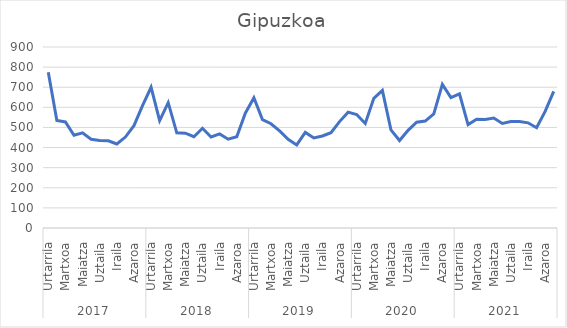
| Category | Gipuzkoa |
|---|---|
| 0 | 774.143 |
| 1 | 535 |
| 2 | 527.429 |
| 3 | 461.429 |
| 4 | 472.857 |
| 5 | 441.571 |
| 6 | 435.571 |
| 7 | 433.714 |
| 8 | 417.857 |
| 9 | 452.143 |
| 10 | 508.714 |
| 11 | 608.571 |
| 12 | 699.714 |
| 13 | 533.714 |
| 14 | 623.286 |
| 15 | 473.429 |
| 16 | 471.714 |
| 17 | 453.857 |
| 18 | 495.857 |
| 19 | 452.571 |
| 20 | 467.857 |
| 21 | 441.714 |
| 22 | 454.143 |
| 23 | 571 |
| 24 | 647.857 |
| 25 | 538.857 |
| 26 | 518.429 |
| 27 | 482.857 |
| 28 | 441 |
| 29 | 413.143 |
| 30 | 475.429 |
| 31 | 447.429 |
| 32 | 457.429 |
| 33 | 474.143 |
| 34 | 529 |
| 35 | 576.143 |
| 36 | 564 |
| 37 | 519.857 |
| 38 | 644.857 |
| 39 | 684.571 |
| 40 | 488.143 |
| 41 | 434.857 |
| 42 | 485.857 |
| 43 | 525.857 |
| 44 | 531.571 |
| 45 | 567.571 |
| 46 | 714.429 |
| 47 | 648.857 |
| 48 | 667 |
| 49 | 514 |
| 50 | 540.857 |
| 51 | 539.289 |
| 52 | 547.143 |
| 53 | 520 |
| 54 | 529 |
| 55 | 529.286 |
| 56 | 523 |
| 57 | 498.286 |
| 58 | 579.718 |
| 59 | 679.429 |